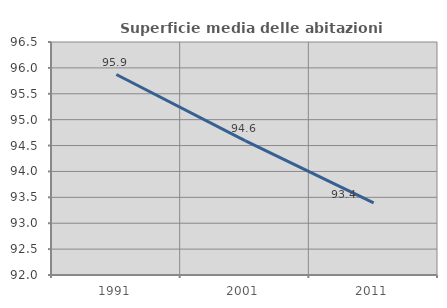
| Category | Superficie media delle abitazioni occupate |
|---|---|
| 1991.0 | 95.872 |
| 2001.0 | 94.595 |
| 2011.0 | 93.392 |